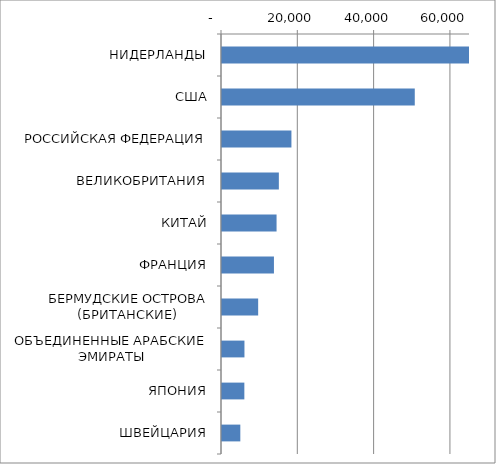
| Category | Series 0 |
|---|---|
| НИДЕРЛАНДЫ | 65108.308 |
| США | 50526.021 |
| РОССИЙСКАЯ ФЕДЕРАЦИЯ | 18195.966 |
| ВЕЛИКОБРИТАНИЯ | 14901.171 |
| КИТАЙ | 14302.677 |
| ФРАНЦИЯ | 13614.04 |
| БЕРМУДСКИЕ ОСТРОВА (БРИТАНСКИЕ) | 9479.351 |
| ОБЪЕДИНЕННЫЕ АРАБСКИЕ ЭМИРАТЫ | 5885.276 |
| ЯПОНИЯ | 5858.072 |
| ШВЕЙЦАРИЯ | 4801.038 |